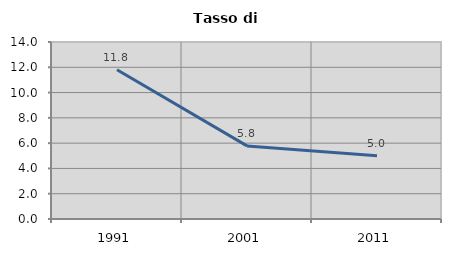
| Category | Tasso di disoccupazione   |
|---|---|
| 1991.0 | 11.803 |
| 2001.0 | 5.782 |
| 2011.0 | 5.009 |